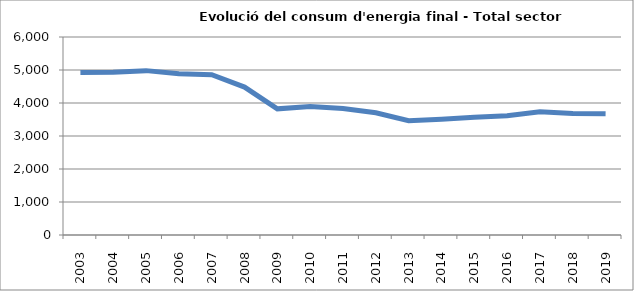
| Category | 4.925,9 |
|---|---|
| 2003.0 | 4925.87 |
| 2004.0 | 4933.9 |
| 2005.0 | 4980.84 |
| 2006.0 | 4889.89 |
| 2007.0 | 4858.59 |
| 2008.0 | 4483 |
| 2009.0 | 3823.11 |
| 2010.0 | 3897.11 |
| 2011.0 | 3836.18 |
| 2012.0 | 3702.47 |
| 2013.0 | 3460.55 |
| 2014.0 | 3510.86 |
| 2015.0 | 3570.55 |
| 2016.0 | 3612.89 |
| 2017.0 | 3732.56 |
| 2018.0 | 3684.23 |
| 2019.0 | 3671.63 |